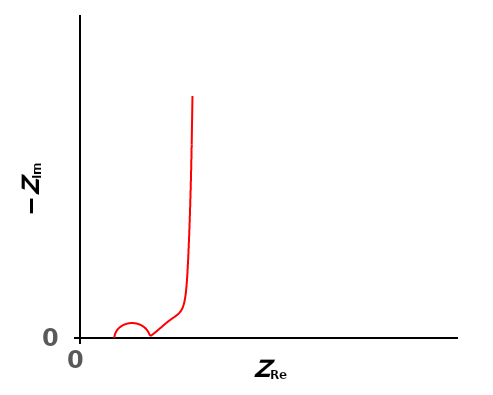
| Category | Series 2 |
|---|---|
| 10.0037623665182 | 0.02 |
| 10.0042331693302 | 0.024 |
| 10.0047682763676 | 0.03 |
| 10.0053795447677 | 0.037 |
| 10.0060826241785 | 0.046 |
| 10.0068987912259 | 0.057 |
| 10.0078578096914 | 0.071 |
| 10.009002409915 | 0.088 |
| 10.0103953263052 | 0.11 |
| 10.0121303775134 | 0.137 |
| 10.0143499344936 | 0.171 |
| 10.0172724754206 | 0.214 |
| 10.0212360462842 | 0.267 |
| 10.0267667415497 | 0.334 |
| 10.0346863822787 | 0.418 |
| 10.0462811950124 | 0.523 |
| 10.0635643942701 | 0.655 |
| 10.0896807397142 | 0.819 |
| 10.1295193056426 | 1.024 |
| 10.1906155649556 | 1.278 |
| 10.2844155931834 | 1.59 |
| 10.4278935606572 | 1.968 |
| 10.6452527971229 | 2.419 |
| 10.9688290302239 | 2.937 |
| 11.4372254736942 | 3.506 |
| 12.0875381754721 | 4.082 |
| 12.9391382604561 | 4.596 |
| 13.9721945224788 | 4.959 |
| 15.1148250246626 | 5.094 |
| 16.2565553884195 | 4.971 |
| 17.287743466889 | 4.623 |
| 18.1384106333041 | 4.128 |
| 18.7905734951714 | 3.575 |
| 19.2647399432642 | 3.032 |
| 19.5984483553171 | 2.541 |
| 19.8303583513044 | 2.122 |
| 19.9927529576262 | 1.776 |
| 20.1098274038866 | 1.499 |
| 20.1986517619177 | 1.283 |
| 20.2708836889465 | 1.119 |
| 20.3343804527205 | 1 |
| 20.3944550628901 | 0.917 |
| 20.4547730159748 | 0.866 |
| 20.5179636998913 | 0.842 |
| 20.5860273419536 | 0.842 |
| 20.6606031844528 | 0.863 |
| 20.7431464677699 | 0.903 |
| 20.8350467958765 | 0.962 |
| 20.9377095195213 | 1.038 |
| 21.0526142767286 | 1.132 |
| 21.1813598678048 | 1.245 |
| 21.3257014248075 | 1.376 |
| 21.4875837772503 | 1.527 |
| 21.6691736311927 | 1.701 |
| 21.8728924179705 | 1.898 |
| 22.10144952021 | 2.121 |
| 22.3578829883122 | 2.374 |
| 22.6456322173605 | 2.658 |
| 22.9685152013669 | 2.978 |
| 23.3304003953049 | 3.338 |
| 23.7353787042999 | 3.743 |
| 24.1900526623482 | 4.202 |
| 24.7067615789952 | 4.721 |
| 25.3022766570674 | 5.3 |
| 25.987629058309 | 5.924 |
| 26.7525814687235 | 6.571 |
| 27.5566978246258 | 7.229 |
| 28.3385641993838 | 7.923 |
| 29.0402923479342 | 8.721 |
| 29.6292434554901 | 9.729 |
| 30.1027896936135 | 11.067 |
| 30.4787568124313 | 12.86 |
| 30.7827907680423 | 15.24 |
| 31.0403200578667 | 18.357 |
| 31.2739714132589 | 22.386 |
| 31.503068795891 | 27.541 |
| 31.7416764120813 | 34.089 |
| 31.9946361140207 | 42.361 |
| 32.2546720708874 | 52.785 |
| 32.5047350655959 | 65.909 |
| 32.7259806546429 | 82.442 |